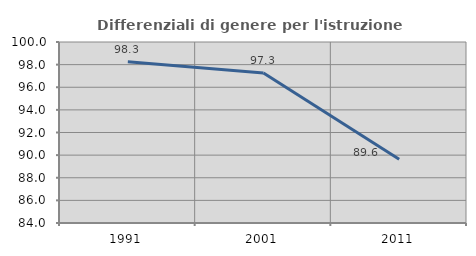
| Category | Differenziali di genere per l'istruzione superiore |
|---|---|
| 1991.0 | 98.26 |
| 2001.0 | 97.257 |
| 2011.0 | 89.641 |